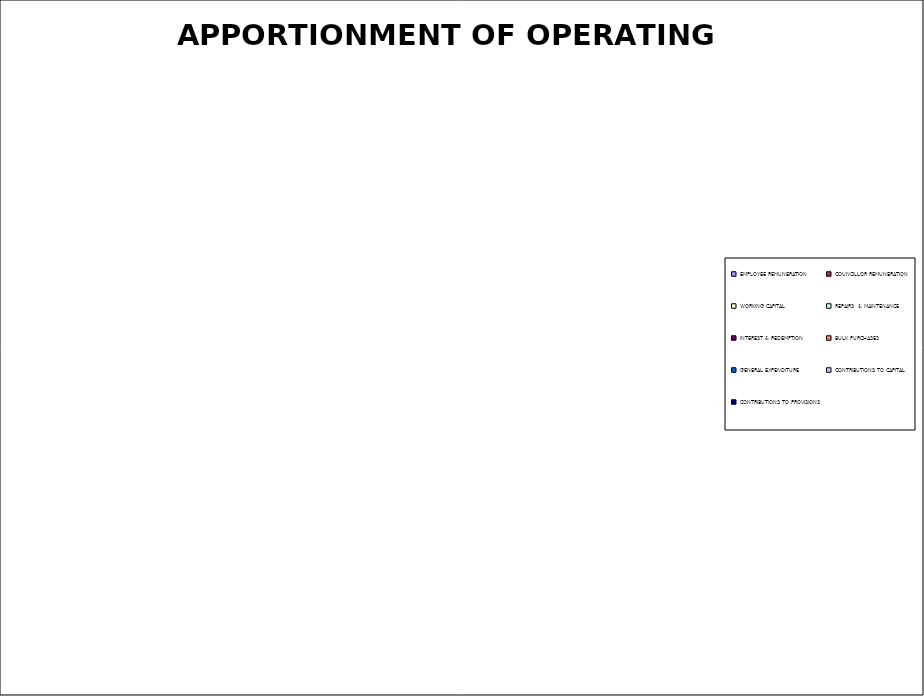
| Category | Series 0 |
|---|---|
| EMPLOYEE REMUNERATION | 0 |
| COUNCILLOR REMUNERATION | 0 |
| WORKING CAPITAL | 0 |
| REPAIRS  & MAINTENANCE | 0 |
| INTEREST & REDEMPTION | 0 |
| BULK PURCHASES  | 0 |
| GENERAL EXPENDITURE | 0 |
| CONTRIBUTIONS TO CAPITAL  | 0 |
| CONTRIBUTIONS TO PROVISIONS | 0 |